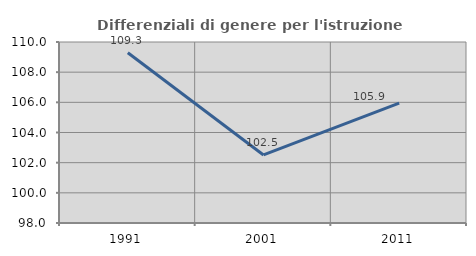
| Category | Differenziali di genere per l'istruzione superiore |
|---|---|
| 1991.0 | 109.288 |
| 2001.0 | 102.51 |
| 2011.0 | 105.946 |